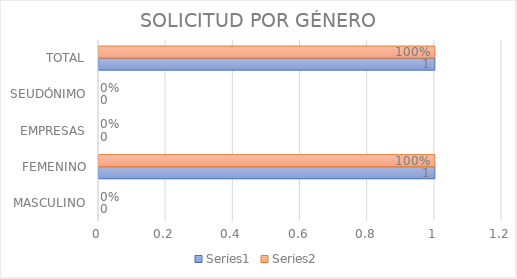
| Category | Series 0 | Series 1 |
|---|---|---|
| MASCULINO | 0 | 0 |
| FEMENINO | 1 | 1 |
| EMPRESAS | 0 | 0 |
| SEUDÓNIMO | 0 | 0 |
| TOTAL | 1 | 1 |